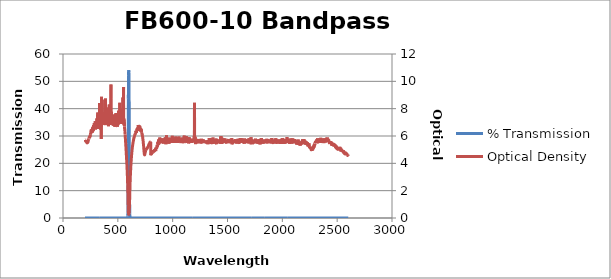
| Category | % Transmission |
|---|---|
| 2600.0 | 0.002 |
| 2599.0 | 0.002 |
| 2598.0 | 0.003 |
| 2597.0 | 0.002 |
| 2596.0 | 0.002 |
| 2595.0 | 0.003 |
| 2594.0 | 0.002 |
| 2593.0 | 0.002 |
| 2592.0 | 0.002 |
| 2591.0 | 0.002 |
| 2590.0 | 0.002 |
| 2589.0 | 0.002 |
| 2588.0 | 0.002 |
| 2587.0 | 0.002 |
| 2586.0 | 0.002 |
| 2585.0 | 0.002 |
| 2584.0 | 0.002 |
| 2583.0 | 0.002 |
| 2582.0 | 0.002 |
| 2581.0 | 0.002 |
| 2580.0 | 0.002 |
| 2579.0 | 0.002 |
| 2578.0 | 0.002 |
| 2577.0 | 0.002 |
| 2576.0 | 0.002 |
| 2575.0 | 0.002 |
| 2574.0 | 0.002 |
| 2573.0 | 0.002 |
| 2572.0 | 0.002 |
| 2571.0 | 0.002 |
| 2570.0 | 0.002 |
| 2569.0 | 0.002 |
| 2568.0 | 0.002 |
| 2567.0 | 0.002 |
| 2566.0 | 0.002 |
| 2565.0 | 0.002 |
| 2564.0 | 0.002 |
| 2563.0 | 0.002 |
| 2562.0 | 0.002 |
| 2561.0 | 0.001 |
| 2560.0 | 0.002 |
| 2559.0 | 0.002 |
| 2558.0 | 0.001 |
| 2557.0 | 0.002 |
| 2556.0 | 0.001 |
| 2555.0 | 0.001 |
| 2554.0 | 0.001 |
| 2553.0 | 0.001 |
| 2552.0 | 0.001 |
| 2551.0 | 0.001 |
| 2550.0 | 0.001 |
| 2549.0 | 0.001 |
| 2548.0 | 0.001 |
| 2547.0 | 0.001 |
| 2546.0 | 0.001 |
| 2545.0 | 0.001 |
| 2544.0 | 0.001 |
| 2543.0 | 0.001 |
| 2542.0 | 0.001 |
| 2541.0 | 0.001 |
| 2540.0 | 0.001 |
| 2539.0 | 0.001 |
| 2538.0 | 0.001 |
| 2537.0 | 0.001 |
| 2536.0 | 0.001 |
| 2535.0 | 0.001 |
| 2534.0 | 0.001 |
| 2533.0 | 0.001 |
| 2532.0 | 0.001 |
| 2531.0 | 0.001 |
| 2530.0 | 0.001 |
| 2529.0 | 0.001 |
| 2528.0 | 0.001 |
| 2527.0 | 0.001 |
| 2526.0 | 0.001 |
| 2525.0 | 0.001 |
| 2524.0 | 0.001 |
| 2523.0 | 0.001 |
| 2522.0 | 0.001 |
| 2521.0 | 0.001 |
| 2520.0 | 0.001 |
| 2519.0 | 0.001 |
| 2518.0 | 0.001 |
| 2517.0 | 0.001 |
| 2516.0 | 0.001 |
| 2515.0 | 0.001 |
| 2514.0 | 0.001 |
| 2513.0 | 0.001 |
| 2512.0 | 0.001 |
| 2511.0 | 0.001 |
| 2510.0 | 0.001 |
| 2509.0 | 0.001 |
| 2508.0 | 0.001 |
| 2507.0 | 0.001 |
| 2506.0 | 0.001 |
| 2505.0 | 0.001 |
| 2504.0 | 0.001 |
| 2503.0 | 0.001 |
| 2502.0 | 0.001 |
| 2501.0 | 0.001 |
| 2500.0 | 0.001 |
| 2499.0 | 0.001 |
| 2498.0 | 0.001 |
| 2497.0 | 0.001 |
| 2496.0 | 0.001 |
| 2495.0 | 0.001 |
| 2494.0 | 0.001 |
| 2493.0 | 0.001 |
| 2492.0 | 0.001 |
| 2491.0 | 0.001 |
| 2490.0 | 0.001 |
| 2489.0 | 0.001 |
| 2488.0 | 0.001 |
| 2487.0 | 0.001 |
| 2486.0 | 0.001 |
| 2485.0 | 0.001 |
| 2484.0 | 0.001 |
| 2483.0 | 0.001 |
| 2482.0 | 0.001 |
| 2481.0 | 0 |
| 2480.0 | 0 |
| 2479.0 | 0.001 |
| 2478.0 | 0.001 |
| 2477.0 | 0.001 |
| 2476.0 | 0.001 |
| 2475.0 | 0 |
| 2474.0 | 0.001 |
| 2473.0 | 0 |
| 2472.0 | 0.001 |
| 2471.0 | 0 |
| 2470.0 | 0.001 |
| 2469.0 | 0 |
| 2468.0 | 0 |
| 2467.0 | 0.001 |
| 2466.0 | 0 |
| 2465.0 | 0 |
| 2464.0 | 0 |
| 2463.0 | 0 |
| 2462.0 | 0.001 |
| 2461.0 | 0 |
| 2460.0 | 0 |
| 2459.0 | 0 |
| 2458.0 | 0.001 |
| 2457.0 | 0 |
| 2456.0 | 0 |
| 2455.0 | 0 |
| 2454.0 | 0.001 |
| 2453.0 | 0 |
| 2452.0 | 0 |
| 2451.0 | 0 |
| 2450.0 | 0 |
| 2449.0 | 0 |
| 2448.0 | 0 |
| 2447.0 | 0 |
| 2446.0 | 0 |
| 2445.0 | 0 |
| 2444.0 | 0 |
| 2443.0 | 0 |
| 2442.0 | 0 |
| 2441.0 | 0 |
| 2440.0 | 0 |
| 2439.0 | 0 |
| 2438.0 | 0 |
| 2437.0 | 0 |
| 2436.0 | 0 |
| 2435.0 | 0 |
| 2434.0 | 0 |
| 2433.0 | 0 |
| 2432.0 | 0 |
| 2431.0 | 0 |
| 2430.0 | 0 |
| 2429.0 | 0 |
| 2428.0 | 0 |
| 2427.0 | 0 |
| 2426.0 | 0 |
| 2425.0 | 0 |
| 2424.0 | 0 |
| 2423.0 | 0 |
| 2422.0 | 0 |
| 2421.0 | 0 |
| 2420.0 | 0 |
| 2419.0 | 0 |
| 2418.0 | 0 |
| 2417.0 | 0 |
| 2416.0 | 0 |
| 2415.0 | 0 |
| 2414.0 | 0 |
| 2413.0 | 0 |
| 2412.0 | 0 |
| 2411.0 | 0 |
| 2410.0 | 0 |
| 2409.0 | 0 |
| 2408.0 | 0 |
| 2407.0 | 0 |
| 2406.0 | 0 |
| 2405.0 | 0 |
| 2404.0 | 0 |
| 2403.0 | 0 |
| 2402.0 | 0 |
| 2401.0 | 0 |
| 2400.0 | 0 |
| 2399.0 | 0 |
| 2398.0 | 0 |
| 2397.0 | 0 |
| 2396.0 | 0 |
| 2395.0 | 0 |
| 2394.0 | 0 |
| 2393.0 | 0 |
| 2392.0 | 0 |
| 2391.0 | 0 |
| 2390.0 | 0 |
| 2389.0 | 0 |
| 2388.0 | 0 |
| 2387.0 | 0 |
| 2386.0 | 0 |
| 2385.0 | 0 |
| 2384.0 | 0 |
| 2383.0 | 0 |
| 2382.0 | 0 |
| 2381.0 | 0 |
| 2380.0 | 0 |
| 2379.0 | 0 |
| 2378.0 | 0 |
| 2377.0 | 0 |
| 2376.0 | 0 |
| 2375.0 | 0 |
| 2374.0 | 0 |
| 2373.0 | 0 |
| 2372.0 | 0 |
| 2371.0 | 0 |
| 2370.0 | 0 |
| 2369.0 | 0 |
| 2368.0 | 0 |
| 2367.0 | 0 |
| 2366.0 | 0 |
| 2365.0 | 0 |
| 2364.0 | 0 |
| 2363.0 | 0 |
| 2362.0 | 0 |
| 2361.0 | 0 |
| 2360.0 | 0 |
| 2359.0 | 0 |
| 2358.0 | 0 |
| 2357.0 | 0 |
| 2356.0 | 0 |
| 2355.0 | 0 |
| 2354.0 | 0 |
| 2353.0 | 0 |
| 2352.0 | 0 |
| 2351.0 | 0 |
| 2350.0 | 0 |
| 2349.0 | 0 |
| 2348.0 | 0 |
| 2347.0 | 0 |
| 2346.0 | 0 |
| 2345.0 | 0 |
| 2344.0 | 0 |
| 2343.0 | 0 |
| 2342.0 | 0 |
| 2341.0 | 0 |
| 2340.0 | 0 |
| 2339.0 | 0 |
| 2338.0 | 0 |
| 2337.0 | 0 |
| 2336.0 | 0 |
| 2335.0 | 0 |
| 2334.0 | 0 |
| 2333.0 | 0 |
| 2332.0 | 0 |
| 2331.0 | 0 |
| 2330.0 | 0 |
| 2329.0 | 0 |
| 2328.0 | 0 |
| 2327.0 | 0 |
| 2326.0 | 0 |
| 2325.0 | 0 |
| 2324.0 | 0 |
| 2323.0 | 0 |
| 2322.0 | 0 |
| 2321.0 | 0 |
| 2320.0 | 0 |
| 2319.0 | 0 |
| 2318.0 | 0 |
| 2317.0 | 0 |
| 2316.0 | 0 |
| 2315.0 | 0 |
| 2314.0 | 0 |
| 2313.0 | 0 |
| 2312.0 | 0 |
| 2311.0 | 0 |
| 2310.0 | 0 |
| 2309.0 | 0 |
| 2308.0 | 0 |
| 2307.0 | 0 |
| 2306.0 | 0 |
| 2305.0 | 0 |
| 2304.0 | 0 |
| 2303.0 | 0 |
| 2302.0 | 0 |
| 2301.0 | 0 |
| 2300.0 | 0 |
| 2299.0 | 0 |
| 2298.0 | 0 |
| 2297.0 | 0 |
| 2296.0 | 0 |
| 2295.0 | 0 |
| 2294.0 | 0 |
| 2293.0 | 0.001 |
| 2292.0 | 0 |
| 2291.0 | 0 |
| 2290.0 | 0.001 |
| 2289.0 | 0.001 |
| 2288.0 | 0.001 |
| 2287.0 | 0.001 |
| 2286.0 | 0 |
| 2285.0 | 0.001 |
| 2284.0 | 0.001 |
| 2283.0 | 0.001 |
| 2282.0 | 0.001 |
| 2281.0 | 0.001 |
| 2280.0 | 0.001 |
| 2279.0 | 0.001 |
| 2278.0 | 0.001 |
| 2277.0 | 0.001 |
| 2276.0 | 0.001 |
| 2275.0 | 0.001 |
| 2274.0 | 0.001 |
| 2273.0 | 0.001 |
| 2272.0 | 0.001 |
| 2271.0 | 0.001 |
| 2270.0 | 0.001 |
| 2269.0 | 0.001 |
| 2268.0 | 0.001 |
| 2267.0 | 0.001 |
| 2266.0 | 0.001 |
| 2265.0 | 0.001 |
| 2264.0 | 0.001 |
| 2263.0 | 0.001 |
| 2262.0 | 0.001 |
| 2261.0 | 0.001 |
| 2260.0 | 0.001 |
| 2259.0 | 0.001 |
| 2258.0 | 0.001 |
| 2257.0 | 0.001 |
| 2256.0 | 0.001 |
| 2255.0 | 0.001 |
| 2254.0 | 0.001 |
| 2253.0 | 0.001 |
| 2252.0 | 0.001 |
| 2251.0 | 0.001 |
| 2250.0 | 0.001 |
| 2249.0 | 0.001 |
| 2248.0 | 0.001 |
| 2247.0 | 0.001 |
| 2246.0 | 0.001 |
| 2245.0 | 0.001 |
| 2244.0 | 0 |
| 2243.0 | 0 |
| 2242.0 | 0 |
| 2241.0 | 0.001 |
| 2240.0 | 0 |
| 2239.0 | 0 |
| 2238.0 | 0.001 |
| 2237.0 | 0 |
| 2236.0 | 0.001 |
| 2235.0 | 0 |
| 2234.0 | 0.001 |
| 2233.0 | 0.001 |
| 2232.0 | 0 |
| 2231.0 | 0 |
| 2230.0 | 0 |
| 2229.0 | 0 |
| 2228.0 | 0 |
| 2227.0 | 0 |
| 2226.0 | 0 |
| 2225.0 | 0 |
| 2224.0 | 0 |
| 2223.0 | 0 |
| 2222.0 | 0 |
| 2221.0 | 0 |
| 2220.0 | 0 |
| 2219.0 | 0 |
| 2218.0 | 0 |
| 2217.0 | 0 |
| 2216.0 | 0 |
| 2215.0 | 0 |
| 2214.0 | 0 |
| 2213.0 | 0 |
| 2212.0 | 0 |
| 2211.0 | 0 |
| 2210.0 | 0 |
| 2209.0 | 0 |
| 2208.0 | 0 |
| 2207.0 | 0 |
| 2206.0 | 0 |
| 2205.0 | 0 |
| 2204.0 | 0 |
| 2203.0 | 0 |
| 2202.0 | 0 |
| 2201.0 | 0 |
| 2200.0 | 0 |
| 2199.0 | 0 |
| 2198.0 | 0 |
| 2197.0 | 0 |
| 2196.0 | 0 |
| 2195.0 | 0 |
| 2194.0 | 0 |
| 2193.0 | 0 |
| 2192.0 | 0 |
| 2191.0 | 0 |
| 2190.0 | 0 |
| 2189.0 | 0 |
| 2188.0 | 0 |
| 2187.0 | 0 |
| 2186.0 | 0 |
| 2185.0 | 0 |
| 2184.0 | 0 |
| 2183.0 | 0 |
| 2182.0 | 0 |
| 2181.0 | 0 |
| 2180.0 | 0 |
| 2179.0 | 0 |
| 2178.0 | 0 |
| 2177.0 | 0 |
| 2176.0 | 0 |
| 2175.0 | 0 |
| 2174.0 | 0 |
| 2173.0 | 0 |
| 2172.0 | 0 |
| 2171.0 | 0 |
| 2170.0 | 0 |
| 2169.0 | 0 |
| 2168.0 | 0 |
| 2167.0 | 0 |
| 2166.0 | 0 |
| 2165.0 | 0 |
| 2164.0 | 0 |
| 2163.0 | 0 |
| 2162.0 | 0 |
| 2161.0 | 0.001 |
| 2160.0 | 0 |
| 2159.0 | 0 |
| 2158.0 | 0 |
| 2157.0 | 0 |
| 2156.0 | 0 |
| 2155.0 | 0 |
| 2154.0 | 0 |
| 2153.0 | 0 |
| 2152.0 | 0 |
| 2151.0 | 0 |
| 2150.0 | 0 |
| 2149.0 | 0 |
| 2148.0 | 0 |
| 2147.0 | 0 |
| 2146.0 | 0 |
| 2145.0 | 0 |
| 2144.0 | 0 |
| 2143.0 | 0 |
| 2142.0 | 0 |
| 2141.0 | 0 |
| 2140.0 | 0 |
| 2139.0 | 0 |
| 2138.0 | 0 |
| 2137.0 | 0 |
| 2136.0 | 0 |
| 2135.0 | 0 |
| 2134.0 | 0 |
| 2133.0 | 0 |
| 2132.0 | 0 |
| 2131.0 | 0 |
| 2130.0 | 0 |
| 2129.0 | 0 |
| 2128.0 | 0 |
| 2127.0 | 0 |
| 2126.0 | 0 |
| 2125.0 | 0 |
| 2124.0 | 0 |
| 2123.0 | 0 |
| 2122.0 | 0 |
| 2121.0 | 0 |
| 2120.0 | 0 |
| 2119.0 | 0 |
| 2118.0 | 0 |
| 2117.0 | 0 |
| 2116.0 | 0 |
| 2115.0 | 0 |
| 2114.0 | 0 |
| 2113.0 | 0 |
| 2112.0 | 0 |
| 2111.0 | 0 |
| 2110.0 | 0 |
| 2109.0 | 0 |
| 2108.0 | 0 |
| 2107.0 | 0 |
| 2106.0 | 0 |
| 2105.0 | 0 |
| 2104.0 | 0 |
| 2103.0 | 0 |
| 2102.0 | 0 |
| 2101.0 | 0 |
| 2100.0 | 0 |
| 2099.0 | 0 |
| 2098.0 | 0 |
| 2097.0 | 0 |
| 2096.0 | 0 |
| 2095.0 | 0 |
| 2094.0 | 0 |
| 2093.0 | 0 |
| 2092.0 | 0 |
| 2091.0 | 0 |
| 2090.0 | 0 |
| 2089.0 | 0 |
| 2088.0 | 0 |
| 2087.0 | 0 |
| 2086.0 | 0 |
| 2085.0 | 0 |
| 2084.0 | 0 |
| 2083.0 | 0 |
| 2082.0 | 0 |
| 2081.0 | 0 |
| 2080.0 | 0 |
| 2079.0 | 0 |
| 2078.0 | 0 |
| 2077.0 | 0 |
| 2076.0 | 0 |
| 2075.0 | 0 |
| 2074.0 | 0 |
| 2073.0 | 0 |
| 2072.0 | 0 |
| 2071.0 | 0 |
| 2070.0 | 0 |
| 2069.0 | 0 |
| 2068.0 | 0 |
| 2067.0 | 0 |
| 2066.0 | 0 |
| 2065.0 | 0 |
| 2064.0 | 0 |
| 2063.0 | 0 |
| 2062.0 | 0 |
| 2061.0 | 0 |
| 2060.0 | 0 |
| 2059.0 | 0 |
| 2058.0 | 0 |
| 2057.0 | 0 |
| 2056.0 | 0 |
| 2055.0 | 0 |
| 2054.0 | 0 |
| 2053.0 | 0 |
| 2052.0 | 0 |
| 2051.0 | 0 |
| 2050.0 | 0 |
| 2049.0 | 0 |
| 2048.0 | 0 |
| 2047.0 | 0 |
| 2046.0 | 0 |
| 2045.0 | 0 |
| 2044.0 | 0 |
| 2043.0 | 0 |
| 2042.0 | 0 |
| 2041.0 | 0 |
| 2040.0 | 0 |
| 2039.0 | 0 |
| 2038.0 | 0 |
| 2037.0 | 0 |
| 2036.0 | 0 |
| 2035.0 | 0 |
| 2034.0 | 0 |
| 2033.0 | 0 |
| 2032.0 | 0 |
| 2031.0 | 0 |
| 2030.0 | 0 |
| 2029.0 | 0 |
| 2028.0 | 0 |
| 2027.0 | 0 |
| 2026.0 | 0 |
| 2025.0 | 0 |
| 2024.0 | 0 |
| 2023.0 | 0 |
| 2022.0 | 0 |
| 2021.0 | 0 |
| 2020.0 | 0 |
| 2019.0 | 0 |
| 2018.0 | 0 |
| 2017.0 | 0 |
| 2016.0 | 0 |
| 2015.0 | 0 |
| 2014.0 | 0 |
| 2013.0 | 0 |
| 2012.0 | 0 |
| 2011.0 | 0 |
| 2010.0 | 0 |
| 2009.0 | 0 |
| 2008.0 | 0 |
| 2007.0 | 0 |
| 2006.0 | 0 |
| 2005.0 | 0 |
| 2004.0 | 0 |
| 2003.0 | 0 |
| 2002.0 | 0 |
| 2001.0 | 0 |
| 2000.0 | 0 |
| 1999.0 | 0 |
| 1998.0 | 0 |
| 1997.0 | 0 |
| 1996.0 | 0 |
| 1995.0 | 0 |
| 1994.0 | 0 |
| 1993.0 | 0 |
| 1992.0 | 0 |
| 1991.0 | 0 |
| 1990.0 | 0 |
| 1989.0 | 0 |
| 1988.0 | 0 |
| 1987.0 | 0 |
| 1986.0 | 0 |
| 1985.0 | 0 |
| 1984.0 | 0 |
| 1983.0 | 0 |
| 1982.0 | 0 |
| 1981.0 | 0 |
| 1980.0 | 0 |
| 1979.0 | 0 |
| 1978.0 | 0 |
| 1977.0 | 0 |
| 1976.0 | 0 |
| 1975.0 | 0 |
| 1974.0 | 0 |
| 1973.0 | 0 |
| 1972.0 | 0 |
| 1971.0 | 0 |
| 1970.0 | 0 |
| 1969.0 | 0 |
| 1968.0 | 0 |
| 1967.0 | 0 |
| 1966.0 | 0 |
| 1965.0 | 0 |
| 1964.0 | 0 |
| 1963.0 | 0 |
| 1962.0 | 0 |
| 1961.0 | 0 |
| 1960.0 | 0 |
| 1959.0 | 0 |
| 1958.0 | 0 |
| 1957.0 | 0 |
| 1956.0 | 0 |
| 1955.0 | 0 |
| 1954.0 | 0 |
| 1953.0 | 0 |
| 1952.0 | 0 |
| 1951.0 | 0 |
| 1950.0 | 0 |
| 1949.0 | 0 |
| 1948.0 | 0 |
| 1947.0 | 0 |
| 1946.0 | 0 |
| 1945.0 | 0 |
| 1944.0 | 0 |
| 1943.0 | 0 |
| 1942.0 | 0 |
| 1941.0 | 0 |
| 1940.0 | 0 |
| 1939.0 | 0 |
| 1938.0 | 0 |
| 1937.0 | 0 |
| 1936.0 | 0 |
| 1935.0 | 0 |
| 1934.0 | 0 |
| 1933.0 | 0 |
| 1932.0 | 0 |
| 1931.0 | 0 |
| 1930.0 | 0 |
| 1929.0 | 0 |
| 1928.0 | 0 |
| 1927.0 | 0 |
| 1926.0 | 0 |
| 1925.0 | 0 |
| 1924.0 | 0 |
| 1923.0 | 0 |
| 1922.0 | 0 |
| 1921.0 | 0 |
| 1920.0 | 0 |
| 1919.0 | 0 |
| 1918.0 | 0 |
| 1917.0 | 0 |
| 1916.0 | 0 |
| 1915.0 | 0 |
| 1914.0 | 0 |
| 1913.0 | 0 |
| 1912.0 | 0 |
| 1911.0 | 0 |
| 1910.0 | 0 |
| 1909.0 | 0 |
| 1908.0 | 0 |
| 1907.0 | 0 |
| 1906.0 | 0 |
| 1905.0 | 0 |
| 1904.0 | 0 |
| 1903.0 | 0 |
| 1902.0 | 0 |
| 1901.0 | 0 |
| 1900.0 | 0 |
| 1899.0 | 0 |
| 1898.0 | 0 |
| 1897.0 | 0 |
| 1896.0 | 0 |
| 1895.0 | 0 |
| 1894.0 | 0 |
| 1893.0 | 0 |
| 1892.0 | 0 |
| 1891.0 | 0 |
| 1890.0 | 0 |
| 1889.0 | 0 |
| 1888.0 | 0 |
| 1887.0 | 0 |
| 1886.0 | 0 |
| 1885.0 | 0 |
| 1884.0 | 0 |
| 1883.0 | 0 |
| 1882.0 | 0 |
| 1881.0 | 0 |
| 1880.0 | 0 |
| 1879.0 | 0 |
| 1878.0 | 0 |
| 1877.0 | 0 |
| 1876.0 | 0 |
| 1875.0 | 0 |
| 1874.0 | 0 |
| 1873.0 | 0 |
| 1872.0 | 0 |
| 1871.0 | 0 |
| 1870.0 | 0 |
| 1869.0 | 0 |
| 1868.0 | 0 |
| 1867.0 | 0 |
| 1866.0 | 0 |
| 1865.0 | 0 |
| 1864.0 | 0 |
| 1863.0 | 0 |
| 1862.0 | 0 |
| 1861.0 | 0 |
| 1860.0 | 0 |
| 1859.0 | 0 |
| 1858.0 | 0 |
| 1857.0 | 0 |
| 1856.0 | 0 |
| 1855.0 | 0 |
| 1854.0 | 0 |
| 1853.0 | 0 |
| 1852.0 | 0 |
| 1851.0 | 0 |
| 1850.0 | 0 |
| 1849.0 | 0 |
| 1848.0 | 0 |
| 1847.0 | 0 |
| 1846.0 | 0 |
| 1845.0 | 0 |
| 1844.0 | 0 |
| 1843.0 | 0 |
| 1842.0 | 0 |
| 1841.0 | 0 |
| 1840.0 | 0 |
| 1839.0 | 0 |
| 1838.0 | 0 |
| 1837.0 | 0 |
| 1836.0 | 0 |
| 1835.0 | 0 |
| 1834.0 | 0 |
| 1833.0 | 0 |
| 1832.0 | 0 |
| 1831.0 | 0 |
| 1830.0 | 0 |
| 1829.0 | 0 |
| 1828.0 | 0 |
| 1827.0 | 0 |
| 1826.0 | 0 |
| 1825.0 | 0 |
| 1824.0 | 0 |
| 1823.0 | 0 |
| 1822.0 | 0 |
| 1821.0 | 0 |
| 1820.0 | 0 |
| 1819.0 | 0 |
| 1818.0 | 0 |
| 1817.0 | 0 |
| 1816.0 | 0 |
| 1815.0 | 0 |
| 1814.0 | 0 |
| 1813.0 | 0 |
| 1812.0 | 0 |
| 1811.0 | 0 |
| 1810.0 | 0 |
| 1809.0 | 0 |
| 1808.0 | 0 |
| 1807.0 | 0 |
| 1806.0 | 0 |
| 1805.0 | 0 |
| 1804.0 | 0 |
| 1803.0 | 0 |
| 1802.0 | 0 |
| 1801.0 | 0 |
| 1800.0 | 0 |
| 1799.0 | 0 |
| 1798.0 | 0 |
| 1797.0 | 0 |
| 1796.0 | 0 |
| 1795.0 | 0 |
| 1794.0 | 0 |
| 1793.0 | 0 |
| 1792.0 | 0 |
| 1791.0 | 0 |
| 1790.0 | 0 |
| 1789.0 | 0 |
| 1788.0 | 0 |
| 1787.0 | 0 |
| 1786.0 | 0 |
| 1785.0 | 0 |
| 1784.0 | 0 |
| 1783.0 | 0 |
| 1782.0 | 0 |
| 1781.0 | 0 |
| 1780.0 | 0 |
| 1779.0 | 0 |
| 1778.0 | 0 |
| 1777.0 | 0 |
| 1776.0 | 0 |
| 1775.0 | 0 |
| 1774.0 | 0 |
| 1773.0 | 0 |
| 1772.0 | 0 |
| 1771.0 | 0 |
| 1770.0 | 0 |
| 1769.0 | 0 |
| 1768.0 | 0 |
| 1767.0 | 0 |
| 1766.0 | 0 |
| 1765.0 | 0 |
| 1764.0 | 0 |
| 1763.0 | 0 |
| 1762.0 | 0 |
| 1761.0 | 0 |
| 1760.0 | 0 |
| 1759.0 | 0 |
| 1758.0 | 0 |
| 1757.0 | 0 |
| 1756.0 | 0 |
| 1755.0 | 0 |
| 1754.0 | 0 |
| 1753.0 | 0 |
| 1752.0 | 0 |
| 1751.0 | 0 |
| 1750.0 | 0 |
| 1749.0 | 0 |
| 1748.0 | 0 |
| 1747.0 | 0 |
| 1746.0 | 0 |
| 1745.0 | 0 |
| 1744.0 | 0 |
| 1743.0 | 0 |
| 1742.0 | 0 |
| 1741.0 | 0 |
| 1740.0 | 0 |
| 1739.0 | 0 |
| 1738.0 | 0 |
| 1737.0 | 0 |
| 1736.0 | 0 |
| 1735.0 | 0 |
| 1734.0 | 0 |
| 1733.0 | 0 |
| 1732.0 | 0 |
| 1731.0 | 0 |
| 1730.0 | 0 |
| 1729.0 | 0 |
| 1728.0 | 0 |
| 1727.0 | 0 |
| 1726.0 | 0 |
| 1725.0 | 0 |
| 1724.0 | 0 |
| 1723.0 | 0 |
| 1722.0 | 0 |
| 1721.0 | 0 |
| 1720.0 | 0 |
| 1719.0 | 0 |
| 1718.0 | 0 |
| 1717.0 | 0 |
| 1716.0 | 0 |
| 1715.0 | 0 |
| 1714.0 | 0 |
| 1713.0 | 0 |
| 1712.0 | 0 |
| 1711.0 | 0 |
| 1710.0 | 0 |
| 1709.0 | 0 |
| 1708.0 | 0 |
| 1707.0 | 0 |
| 1706.0 | 0 |
| 1705.0 | 0 |
| 1704.0 | 0 |
| 1703.0 | 0 |
| 1702.0 | 0 |
| 1701.0 | 0 |
| 1700.0 | 0 |
| 1699.0 | 0 |
| 1698.0 | 0 |
| 1697.0 | 0 |
| 1696.0 | 0 |
| 1695.0 | 0 |
| 1694.0 | 0 |
| 1693.0 | 0 |
| 1692.0 | 0 |
| 1691.0 | 0 |
| 1690.0 | 0 |
| 1689.0 | 0 |
| 1688.0 | 0 |
| 1687.0 | 0 |
| 1686.0 | 0 |
| 1685.0 | 0 |
| 1684.0 | 0 |
| 1683.0 | 0 |
| 1682.0 | 0 |
| 1681.0 | 0 |
| 1680.0 | 0 |
| 1679.0 | 0 |
| 1678.0 | 0 |
| 1677.0 | 0 |
| 1676.0 | 0 |
| 1675.0 | 0 |
| 1674.0 | 0 |
| 1673.0 | 0 |
| 1672.0 | 0 |
| 1671.0 | 0 |
| 1670.0 | 0 |
| 1669.0 | 0 |
| 1668.0 | 0 |
| 1667.0 | 0 |
| 1666.0 | 0 |
| 1665.0 | 0 |
| 1664.0 | 0 |
| 1663.0 | 0 |
| 1662.0 | 0 |
| 1661.0 | 0 |
| 1660.0 | 0 |
| 1659.0 | 0 |
| 1658.0 | 0 |
| 1657.0 | 0 |
| 1656.0 | 0 |
| 1655.0 | 0 |
| 1654.0 | 0 |
| 1653.0 | 0 |
| 1652.0 | 0 |
| 1651.0 | 0 |
| 1650.0 | 0 |
| 1649.0 | 0 |
| 1648.0 | 0 |
| 1647.0 | 0 |
| 1646.0 | 0 |
| 1645.0 | 0 |
| 1644.0 | 0 |
| 1643.0 | 0 |
| 1642.0 | 0 |
| 1641.0 | 0 |
| 1640.0 | 0 |
| 1639.0 | 0 |
| 1638.0 | 0 |
| 1637.0 | 0 |
| 1636.0 | 0 |
| 1635.0 | 0 |
| 1634.0 | 0 |
| 1633.0 | 0 |
| 1632.0 | 0 |
| 1631.0 | 0 |
| 1630.0 | 0 |
| 1629.0 | 0 |
| 1628.0 | 0 |
| 1627.0 | 0 |
| 1626.0 | 0 |
| 1625.0 | 0 |
| 1624.0 | 0 |
| 1623.0 | 0 |
| 1622.0 | 0 |
| 1621.0 | 0 |
| 1620.0 | 0 |
| 1619.0 | 0 |
| 1618.0 | 0 |
| 1617.0 | 0 |
| 1616.0 | 0 |
| 1615.0 | 0 |
| 1614.0 | 0 |
| 1613.0 | 0 |
| 1612.0 | 0 |
| 1611.0 | 0 |
| 1610.0 | 0 |
| 1609.0 | 0 |
| 1608.0 | 0 |
| 1607.0 | 0 |
| 1606.0 | 0 |
| 1605.0 | 0 |
| 1604.0 | 0 |
| 1603.0 | 0 |
| 1602.0 | 0 |
| 1601.0 | 0 |
| 1600.0 | 0 |
| 1599.0 | 0 |
| 1598.0 | 0 |
| 1597.0 | 0 |
| 1596.0 | 0 |
| 1595.0 | 0 |
| 1594.0 | 0 |
| 1593.0 | 0 |
| 1592.0 | 0 |
| 1591.0 | 0 |
| 1590.0 | 0 |
| 1589.0 | 0 |
| 1588.0 | 0 |
| 1587.0 | 0 |
| 1586.0 | 0 |
| 1585.0 | 0 |
| 1584.0 | 0 |
| 1583.0 | 0 |
| 1582.0 | 0 |
| 1581.0 | 0 |
| 1580.0 | 0 |
| 1579.0 | 0 |
| 1578.0 | 0 |
| 1577.0 | 0 |
| 1576.0 | 0 |
| 1575.0 | 0 |
| 1574.0 | 0 |
| 1573.0 | 0 |
| 1572.0 | 0 |
| 1571.0 | 0 |
| 1570.0 | 0 |
| 1569.0 | 0 |
| 1568.0 | 0 |
| 1567.0 | 0 |
| 1566.0 | 0 |
| 1565.0 | 0 |
| 1564.0 | 0 |
| 1563.0 | 0 |
| 1562.0 | 0 |
| 1561.0 | 0 |
| 1560.0 | 0 |
| 1559.0 | 0 |
| 1558.0 | 0 |
| 1557.0 | 0 |
| 1556.0 | 0 |
| 1555.0 | 0 |
| 1554.0 | 0 |
| 1553.0 | 0 |
| 1552.0 | 0 |
| 1551.0 | 0 |
| 1550.0 | 0 |
| 1549.0 | 0 |
| 1548.0 | 0 |
| 1547.0 | 0 |
| 1546.0 | 0 |
| 1545.0 | 0 |
| 1544.0 | 0 |
| 1543.0 | 0 |
| 1542.0 | 0 |
| 1541.0 | 0 |
| 1540.0 | 0 |
| 1539.0 | 0 |
| 1538.0 | 0 |
| 1537.0 | 0 |
| 1536.0 | 0 |
| 1535.0 | 0 |
| 1534.0 | 0 |
| 1533.0 | 0 |
| 1532.0 | 0 |
| 1531.0 | 0 |
| 1530.0 | 0 |
| 1529.0 | 0 |
| 1528.0 | 0 |
| 1527.0 | 0 |
| 1526.0 | 0 |
| 1525.0 | 0 |
| 1524.0 | 0 |
| 1523.0 | 0 |
| 1522.0 | 0 |
| 1521.0 | 0 |
| 1520.0 | 0 |
| 1519.0 | 0 |
| 1518.0 | 0 |
| 1517.0 | 0 |
| 1516.0 | 0 |
| 1515.0 | 0 |
| 1514.0 | 0 |
| 1513.0 | 0 |
| 1512.0 | 0 |
| 1511.0 | 0 |
| 1510.0 | 0 |
| 1509.0 | 0 |
| 1508.0 | 0 |
| 1507.0 | 0 |
| 1506.0 | 0 |
| 1505.0 | 0 |
| 1504.0 | 0 |
| 1503.0 | 0 |
| 1502.0 | 0 |
| 1501.0 | 0 |
| 1500.0 | 0 |
| 1499.0 | 0 |
| 1498.0 | 0 |
| 1497.0 | 0 |
| 1496.0 | 0 |
| 1495.0 | 0 |
| 1494.0 | 0 |
| 1493.0 | 0 |
| 1492.0 | 0 |
| 1491.0 | 0 |
| 1490.0 | 0 |
| 1489.0 | 0 |
| 1488.0 | 0 |
| 1487.0 | 0 |
| 1486.0 | 0 |
| 1485.0 | 0 |
| 1484.0 | 0 |
| 1483.0 | 0 |
| 1482.0 | 0 |
| 1481.0 | 0 |
| 1480.0 | 0 |
| 1479.0 | 0 |
| 1478.0 | 0 |
| 1477.0 | 0 |
| 1476.0 | 0 |
| 1475.0 | 0 |
| 1474.0 | 0 |
| 1473.0 | 0 |
| 1472.0 | 0 |
| 1471.0 | 0 |
| 1470.0 | 0 |
| 1469.0 | 0 |
| 1468.0 | 0 |
| 1467.0 | 0 |
| 1466.0 | 0 |
| 1465.0 | 0 |
| 1464.0 | 0 |
| 1463.0 | 0 |
| 1462.0 | 0 |
| 1461.0 | 0 |
| 1460.0 | 0 |
| 1459.0 | 0 |
| 1458.0 | 0 |
| 1457.0 | 0 |
| 1456.0 | 0 |
| 1455.0 | 0 |
| 1454.0 | 0 |
| 1453.0 | 0 |
| 1452.0 | 0 |
| 1451.0 | 0 |
| 1450.0 | 0 |
| 1449.0 | 0 |
| 1448.0 | 0 |
| 1447.0 | 0 |
| 1446.0 | 0 |
| 1445.0 | 0 |
| 1444.0 | 0 |
| 1443.0 | 0 |
| 1442.0 | 0 |
| 1441.0 | 0 |
| 1440.0 | 0 |
| 1439.0 | 0 |
| 1438.0 | 0 |
| 1437.0 | 0 |
| 1436.0 | 0 |
| 1435.0 | 0 |
| 1434.0 | 0 |
| 1433.0 | 0 |
| 1432.0 | 0 |
| 1431.0 | 0 |
| 1430.0 | 0 |
| 1429.0 | 0 |
| 1428.0 | 0 |
| 1427.0 | 0 |
| 1426.0 | 0 |
| 1425.0 | 0 |
| 1424.0 | 0 |
| 1423.0 | 0 |
| 1422.0 | 0 |
| 1421.0 | 0 |
| 1420.0 | 0 |
| 1419.0 | 0 |
| 1418.0 | 0 |
| 1417.0 | 0 |
| 1416.0 | 0 |
| 1415.0 | 0 |
| 1414.0 | 0 |
| 1413.0 | 0 |
| 1412.0 | 0 |
| 1411.0 | 0 |
| 1410.0 | 0 |
| 1409.0 | 0 |
| 1408.0 | 0 |
| 1407.0 | 0 |
| 1406.0 | 0 |
| 1405.0 | 0 |
| 1404.0 | 0 |
| 1403.0 | 0 |
| 1402.0 | 0 |
| 1401.0 | 0 |
| 1400.0 | 0 |
| 1399.0 | 0 |
| 1398.0 | 0 |
| 1397.0 | 0 |
| 1396.0 | 0 |
| 1395.0 | 0 |
| 1394.0 | 0 |
| 1393.0 | 0 |
| 1392.0 | 0 |
| 1391.0 | 0 |
| 1390.0 | 0 |
| 1389.0 | 0 |
| 1388.0 | 0 |
| 1387.0 | 0 |
| 1386.0 | 0 |
| 1385.0 | 0 |
| 1384.0 | 0 |
| 1383.0 | 0 |
| 1382.0 | 0 |
| 1381.0 | 0 |
| 1380.0 | 0 |
| 1379.0 | 0 |
| 1378.0 | 0 |
| 1377.0 | 0 |
| 1376.0 | 0 |
| 1375.0 | 0 |
| 1374.0 | 0 |
| 1373.0 | 0 |
| 1372.0 | 0 |
| 1371.0 | 0 |
| 1370.0 | 0 |
| 1369.0 | 0 |
| 1368.0 | 0 |
| 1367.0 | 0 |
| 1366.0 | 0 |
| 1365.0 | 0 |
| 1364.0 | 0 |
| 1363.0 | 0 |
| 1362.0 | 0 |
| 1361.0 | 0 |
| 1360.0 | 0 |
| 1359.0 | 0 |
| 1358.0 | 0 |
| 1357.0 | 0 |
| 1356.0 | 0 |
| 1355.0 | 0 |
| 1354.0 | 0 |
| 1353.0 | 0 |
| 1352.0 | 0 |
| 1351.0 | 0 |
| 1350.0 | 0 |
| 1349.0 | 0 |
| 1348.0 | 0 |
| 1347.0 | 0 |
| 1346.0 | 0 |
| 1345.0 | 0 |
| 1344.0 | 0 |
| 1343.0 | 0 |
| 1342.0 | 0 |
| 1341.0 | 0 |
| 1340.0 | 0 |
| 1339.0 | 0 |
| 1338.0 | 0 |
| 1337.0 | 0 |
| 1336.0 | 0 |
| 1335.0 | 0 |
| 1334.0 | 0 |
| 1333.0 | 0 |
| 1332.0 | 0 |
| 1331.0 | 0 |
| 1330.0 | 0 |
| 1329.0 | 0 |
| 1328.0 | 0 |
| 1327.0 | 0 |
| 1326.0 | 0 |
| 1325.0 | 0 |
| 1324.0 | 0 |
| 1323.0 | 0 |
| 1322.0 | 0 |
| 1321.0 | 0 |
| 1320.0 | 0 |
| 1319.0 | 0 |
| 1318.0 | 0 |
| 1317.0 | 0 |
| 1316.0 | 0 |
| 1315.0 | 0 |
| 1314.0 | 0 |
| 1313.0 | 0 |
| 1312.0 | 0 |
| 1311.0 | 0 |
| 1310.0 | 0 |
| 1309.0 | 0 |
| 1308.0 | 0 |
| 1307.0 | 0 |
| 1306.0 | 0 |
| 1305.0 | 0 |
| 1304.0 | 0 |
| 1303.0 | 0 |
| 1302.0 | 0 |
| 1301.0 | 0 |
| 1300.0 | 0 |
| 1299.0 | 0 |
| 1298.0 | 0 |
| 1297.0 | 0 |
| 1296.0 | 0 |
| 1295.0 | 0 |
| 1294.0 | 0 |
| 1293.0 | 0 |
| 1292.0 | 0 |
| 1291.0 | 0 |
| 1290.0 | 0 |
| 1289.0 | 0 |
| 1288.0 | 0 |
| 1287.0 | 0 |
| 1286.0 | 0 |
| 1285.0 | 0 |
| 1284.0 | 0 |
| 1283.0 | 0 |
| 1282.0 | 0 |
| 1281.0 | 0 |
| 1280.0 | 0 |
| 1279.0 | 0 |
| 1278.0 | 0 |
| 1277.0 | 0 |
| 1276.0 | 0 |
| 1275.0 | 0 |
| 1274.0 | 0 |
| 1273.0 | 0 |
| 1272.0 | 0 |
| 1271.0 | 0 |
| 1270.0 | 0 |
| 1269.0 | 0 |
| 1268.0 | 0 |
| 1267.0 | 0 |
| 1266.0 | 0 |
| 1265.0 | 0 |
| 1264.0 | 0 |
| 1263.0 | 0 |
| 1262.0 | 0 |
| 1261.0 | 0 |
| 1260.0 | 0 |
| 1259.0 | 0 |
| 1258.0 | 0 |
| 1257.0 | 0 |
| 1256.0 | 0 |
| 1255.0 | 0 |
| 1254.0 | 0 |
| 1253.0 | 0 |
| 1252.0 | 0 |
| 1251.0 | 0 |
| 1250.0 | 0 |
| 1249.0 | 0 |
| 1248.0 | 0 |
| 1247.0 | 0 |
| 1246.0 | 0 |
| 1245.0 | 0 |
| 1244.0 | 0 |
| 1243.0 | 0 |
| 1242.0 | 0 |
| 1241.0 | 0 |
| 1240.0 | 0 |
| 1239.0 | 0 |
| 1238.0 | 0 |
| 1237.0 | 0 |
| 1236.0 | 0 |
| 1235.0 | 0 |
| 1234.0 | 0 |
| 1233.0 | 0 |
| 1232.0 | 0 |
| 1231.0 | 0 |
| 1230.0 | 0 |
| 1229.0 | 0 |
| 1228.0 | 0 |
| 1227.0 | 0 |
| 1226.0 | 0 |
| 1225.0 | 0 |
| 1224.0 | 0 |
| 1223.0 | 0 |
| 1222.0 | 0 |
| 1221.0 | 0 |
| 1220.0 | 0 |
| 1219.0 | 0 |
| 1218.0 | 0 |
| 1217.0 | 0 |
| 1216.0 | 0 |
| 1215.0 | 0 |
| 1214.0 | 0 |
| 1213.0 | 0 |
| 1212.0 | 0 |
| 1211.0 | 0 |
| 1210.0 | 0 |
| 1209.0 | 0 |
| 1208.0 | 0 |
| 1207.0 | 0 |
| 1206.0 | 0 |
| 1205.0 | 0 |
| 1204.0 | 0 |
| 1203.0 | 0 |
| 1202.0 | 0 |
| 1201.0 | 0 |
| 1200.0 | 0 |
| 1199.0 | 0 |
| 1198.0 | 0 |
| 1197.0 | 0 |
| 1196.0 | 0 |
| 1195.0 | 0 |
| 1194.0 | 0 |
| 1193.0 | 0 |
| 1192.0 | 0 |
| 1191.0 | 0 |
| 1190.0 | 0 |
| 1189.0 | 0 |
| 1188.0 | 0 |
| 1187.0 | 0 |
| 1186.0 | 0 |
| 1185.0 | 0 |
| 1184.0 | 0 |
| 1183.0 | 0 |
| 1182.0 | 0 |
| 1181.0 | 0 |
| 1180.0 | 0 |
| 1179.0 | 0 |
| 1178.0 | 0 |
| 1177.0 | 0 |
| 1176.0 | 0 |
| 1175.0 | 0 |
| 1174.0 | 0 |
| 1173.0 | 0 |
| 1172.0 | 0 |
| 1171.0 | 0 |
| 1170.0 | 0 |
| 1169.0 | 0 |
| 1168.0 | 0 |
| 1167.0 | 0 |
| 1166.0 | 0 |
| 1165.0 | 0 |
| 1164.0 | 0 |
| 1163.0 | 0 |
| 1162.0 | 0 |
| 1161.0 | 0 |
| 1160.0 | 0 |
| 1159.0 | 0 |
| 1158.0 | 0 |
| 1157.0 | 0 |
| 1156.0 | 0 |
| 1155.0 | 0 |
| 1154.0 | 0 |
| 1153.0 | 0 |
| 1152.0 | 0 |
| 1151.0 | 0 |
| 1150.0 | 0 |
| 1149.0 | 0 |
| 1148.0 | 0 |
| 1147.0 | 0 |
| 1146.0 | 0 |
| 1145.0 | 0 |
| 1144.0 | 0 |
| 1143.0 | 0 |
| 1142.0 | 0 |
| 1141.0 | 0 |
| 1140.0 | 0 |
| 1139.0 | 0 |
| 1138.0 | 0 |
| 1137.0 | 0 |
| 1136.0 | 0 |
| 1135.0 | 0 |
| 1134.0 | 0 |
| 1133.0 | 0 |
| 1132.0 | 0 |
| 1131.0 | 0 |
| 1130.0 | 0 |
| 1129.0 | 0 |
| 1128.0 | 0 |
| 1127.0 | 0 |
| 1126.0 | 0 |
| 1125.0 | 0 |
| 1124.0 | 0 |
| 1123.0 | 0 |
| 1122.0 | 0 |
| 1121.0 | 0 |
| 1120.0 | 0 |
| 1119.0 | 0 |
| 1118.0 | 0 |
| 1117.0 | 0 |
| 1116.0 | 0 |
| 1115.0 | 0 |
| 1114.0 | 0 |
| 1113.0 | 0 |
| 1112.0 | 0 |
| 1111.0 | 0 |
| 1110.0 | 0 |
| 1109.0 | 0 |
| 1108.0 | 0 |
| 1107.0 | 0 |
| 1106.0 | 0 |
| 1105.0 | 0 |
| 1104.0 | 0 |
| 1103.0 | 0 |
| 1102.0 | 0 |
| 1101.0 | 0 |
| 1100.0 | 0 |
| 1099.0 | 0 |
| 1098.0 | 0 |
| 1097.0 | 0 |
| 1096.0 | 0 |
| 1095.0 | 0 |
| 1094.0 | 0 |
| 1093.0 | 0 |
| 1092.0 | 0 |
| 1091.0 | 0 |
| 1090.0 | 0 |
| 1089.0 | 0 |
| 1088.0 | 0 |
| 1087.0 | 0 |
| 1086.0 | 0 |
| 1085.0 | 0 |
| 1084.0 | 0 |
| 1083.0 | 0 |
| 1082.0 | 0 |
| 1081.0 | 0 |
| 1080.0 | 0 |
| 1079.0 | 0 |
| 1078.0 | 0 |
| 1077.0 | 0 |
| 1076.0 | 0 |
| 1075.0 | 0 |
| 1074.0 | 0 |
| 1073.0 | 0 |
| 1072.0 | 0 |
| 1071.0 | 0 |
| 1070.0 | 0 |
| 1069.0 | 0 |
| 1068.0 | 0 |
| 1067.0 | 0 |
| 1066.0 | 0 |
| 1065.0 | 0 |
| 1064.0 | 0 |
| 1063.0 | 0 |
| 1062.0 | 0 |
| 1061.0 | 0 |
| 1060.0 | 0 |
| 1059.0 | 0 |
| 1058.0 | 0 |
| 1057.0 | 0 |
| 1056.0 | 0 |
| 1055.0 | 0 |
| 1054.0 | 0 |
| 1053.0 | 0 |
| 1052.0 | 0 |
| 1051.0 | 0 |
| 1050.0 | 0 |
| 1049.0 | 0 |
| 1048.0 | 0 |
| 1047.0 | 0 |
| 1046.0 | 0 |
| 1045.0 | 0 |
| 1044.0 | 0 |
| 1043.0 | 0 |
| 1042.0 | 0 |
| 1041.0 | 0 |
| 1040.0 | 0 |
| 1039.0 | 0 |
| 1038.0 | 0 |
| 1037.0 | 0 |
| 1036.0 | 0 |
| 1035.0 | 0 |
| 1034.0 | 0 |
| 1033.0 | 0 |
| 1032.0 | 0 |
| 1031.0 | 0 |
| 1030.0 | 0 |
| 1029.0 | 0 |
| 1028.0 | 0 |
| 1027.0 | 0 |
| 1026.0 | 0 |
| 1025.0 | 0 |
| 1024.0 | 0 |
| 1023.0 | 0 |
| 1022.0 | 0 |
| 1021.0 | 0 |
| 1020.0 | 0 |
| 1019.0 | 0 |
| 1018.0 | 0 |
| 1017.0 | 0 |
| 1016.0 | 0 |
| 1015.0 | 0 |
| 1014.0 | 0 |
| 1013.0 | 0 |
| 1012.0 | 0 |
| 1011.0 | 0 |
| 1010.0 | 0 |
| 1009.0 | 0 |
| 1008.0 | 0 |
| 1007.0 | 0 |
| 1006.0 | 0 |
| 1005.0 | 0 |
| 1004.0 | 0 |
| 1003.0 | 0 |
| 1002.0 | 0 |
| 1001.0 | 0 |
| 1000.0 | 0 |
| 999.0 | 0 |
| 998.0 | 0 |
| 997.0 | 0 |
| 996.0 | 0 |
| 995.0 | 0 |
| 994.0 | 0 |
| 993.0 | 0 |
| 992.0 | 0 |
| 991.0 | 0 |
| 990.0 | 0 |
| 989.0 | 0 |
| 988.0 | 0 |
| 987.0 | 0 |
| 986.0 | 0 |
| 985.0 | 0 |
| 984.0 | 0 |
| 983.0 | 0 |
| 982.0 | 0 |
| 981.0 | 0 |
| 980.0 | 0 |
| 979.0 | 0 |
| 978.0 | 0 |
| 977.0 | 0 |
| 976.0 | 0 |
| 975.0 | 0 |
| 974.0 | 0 |
| 973.0 | 0 |
| 972.0 | 0 |
| 971.0 | 0 |
| 970.0 | 0 |
| 969.0 | 0 |
| 968.0 | 0 |
| 967.0 | 0 |
| 966.0 | 0 |
| 965.0 | 0 |
| 964.0 | 0 |
| 963.0 | 0 |
| 962.0 | 0 |
| 961.0 | 0 |
| 960.0 | 0 |
| 959.0 | 0 |
| 958.0 | 0 |
| 957.0 | 0 |
| 956.0 | 0 |
| 955.0 | 0 |
| 954.0 | 0 |
| 953.0 | 0 |
| 952.0 | 0 |
| 951.0 | 0 |
| 950.0 | 0 |
| 949.0 | 0 |
| 948.0 | 0 |
| 947.0 | 0 |
| 946.0 | 0 |
| 945.0 | 0 |
| 944.0 | 0 |
| 943.0 | 0 |
| 942.0 | 0 |
| 941.0 | 0 |
| 940.0 | 0 |
| 939.0 | 0 |
| 938.0 | 0 |
| 937.0 | 0 |
| 936.0 | 0 |
| 935.0 | 0 |
| 934.0 | 0 |
| 933.0 | 0 |
| 932.0 | 0 |
| 931.0 | 0 |
| 930.0 | 0 |
| 929.0 | 0 |
| 928.0 | 0 |
| 927.0 | 0 |
| 926.0 | 0 |
| 925.0 | 0 |
| 924.0 | 0 |
| 923.0 | 0 |
| 922.0 | 0 |
| 921.0 | 0 |
| 920.0 | 0 |
| 919.0 | 0 |
| 918.0 | 0 |
| 917.0 | 0 |
| 916.0 | 0 |
| 915.0 | 0 |
| 914.0 | 0 |
| 913.0 | 0 |
| 912.0 | 0 |
| 911.0 | 0 |
| 910.0 | 0 |
| 909.0 | 0 |
| 908.0 | 0 |
| 907.0 | 0 |
| 906.0 | 0 |
| 905.0 | 0 |
| 904.0 | 0 |
| 903.0 | 0 |
| 902.0 | 0 |
| 901.0 | 0 |
| 900.0 | 0 |
| 899.0 | 0 |
| 898.0 | 0 |
| 897.0 | 0 |
| 896.0 | 0 |
| 895.0 | 0 |
| 894.0 | 0 |
| 893.0 | 0 |
| 892.0 | 0 |
| 891.0 | 0 |
| 890.0 | 0 |
| 889.0 | 0 |
| 888.0 | 0 |
| 887.0 | 0 |
| 886.0 | 0 |
| 885.0 | 0 |
| 884.0 | 0 |
| 883.0 | 0 |
| 882.0 | 0 |
| 881.0 | 0 |
| 880.0 | 0 |
| 879.0 | 0 |
| 878.0 | 0 |
| 877.0 | 0 |
| 876.0 | 0 |
| 875.0 | 0 |
| 874.0 | 0 |
| 873.0 | 0 |
| 872.0 | 0 |
| 871.0 | 0 |
| 870.0 | 0 |
| 869.0 | 0 |
| 868.0 | 0 |
| 867.0 | 0 |
| 866.0 | 0 |
| 865.0 | 0 |
| 864.0 | 0 |
| 863.0 | 0 |
| 862.0 | 0.001 |
| 861.0 | 0.001 |
| 860.0 | 0.001 |
| 859.0 | 0 |
| 858.0 | 0 |
| 857.0 | 0.001 |
| 856.0 | 0.001 |
| 855.0 | 0.001 |
| 854.0 | 0.001 |
| 853.0 | 0.001 |
| 852.0 | 0.001 |
| 851.0 | 0.001 |
| 850.0 | 0.001 |
| 849.0 | 0.001 |
| 848.0 | 0.001 |
| 847.0 | 0.001 |
| 846.0 | 0.001 |
| 845.0 | 0.001 |
| 844.0 | 0.001 |
| 843.0 | 0.001 |
| 842.0 | 0.001 |
| 841.0 | 0.001 |
| 840.0 | 0.001 |
| 839.0 | 0.001 |
| 838.0 | 0.001 |
| 837.0 | 0.001 |
| 836.0 | 0.001 |
| 835.0 | 0.001 |
| 834.0 | 0.001 |
| 833.0 | 0.001 |
| 832.0 | 0.001 |
| 831.0 | 0.001 |
| 830.0 | 0.002 |
| 829.0 | 0.001 |
| 828.0 | 0.001 |
| 827.0 | 0.001 |
| 826.0 | 0.001 |
| 825.0 | 0.001 |
| 824.0 | 0.001 |
| 823.0 | 0.002 |
| 822.0 | 0.002 |
| 821.0 | 0.001 |
| 820.0 | 0.001 |
| 819.0 | 0.001 |
| 818.0 | 0.001 |
| 817.0 | 0.001 |
| 816.0 | 0.001 |
| 815.0 | 0.002 |
| 814.0 | 0.002 |
| 813.0 | 0.002 |
| 812.0 | 0.001 |
| 811.0 | 0.001 |
| 810.0 | 0.002 |
| 809.0 | 0.002 |
| 808.0 | 0.002 |
| 807.0 | 0.002 |
| 806.0 | 0.002 |
| 805.0 | 0.002 |
| 804.0 | 0.002 |
| 803.0 | 0.002 |
| 802.0 | 0.002 |
| 801.0 | 0.002 |
| 800.0 | 0.002 |
| 799.0 | 0 |
| 798.0 | 0 |
| 797.0 | 0 |
| 796.0 | 0 |
| 795.0 | 0 |
| 794.0 | 0 |
| 793.0 | 0 |
| 792.0 | 0 |
| 791.0 | 0 |
| 790.0 | 0 |
| 789.0 | 0 |
| 788.0 | 0 |
| 787.0 | 0 |
| 786.0 | 0 |
| 785.0 | 0 |
| 784.0 | 0 |
| 783.0 | 0 |
| 782.0 | 0 |
| 781.0 | 0 |
| 780.0 | 0.001 |
| 779.0 | 0.001 |
| 778.0 | 0.001 |
| 777.0 | 0.001 |
| 776.0 | 0.001 |
| 775.0 | 0.001 |
| 774.0 | 0.001 |
| 773.0 | 0.001 |
| 772.0 | 0.001 |
| 771.0 | 0.001 |
| 770.0 | 0.001 |
| 769.0 | 0.001 |
| 768.0 | 0.001 |
| 767.0 | 0.001 |
| 766.0 | 0.001 |
| 765.0 | 0.001 |
| 764.0 | 0.001 |
| 763.0 | 0.001 |
| 762.0 | 0.001 |
| 761.0 | 0.001 |
| 760.0 | 0.001 |
| 759.0 | 0.001 |
| 758.0 | 0.001 |
| 757.0 | 0.001 |
| 756.0 | 0.001 |
| 755.0 | 0.001 |
| 754.0 | 0.001 |
| 753.0 | 0.001 |
| 752.0 | 0.001 |
| 751.0 | 0.001 |
| 750.0 | 0.002 |
| 749.0 | 0.002 |
| 748.0 | 0.002 |
| 747.0 | 0.002 |
| 746.0 | 0.002 |
| 745.0 | 0.002 |
| 744.0 | 0.002 |
| 743.0 | 0.002 |
| 742.0 | 0.002 |
| 741.0 | 0.002 |
| 740.0 | 0.002 |
| 739.0 | 0.001 |
| 738.0 | 0.001 |
| 737.0 | 0.001 |
| 736.0 | 0.001 |
| 735.0 | 0.001 |
| 734.0 | 0 |
| 733.0 | 0 |
| 732.0 | 0 |
| 731.0 | 0 |
| 730.0 | 0 |
| 729.0 | 0 |
| 728.0 | 0 |
| 727.0 | 0 |
| 726.0 | 0 |
| 725.0 | 0 |
| 724.0 | 0 |
| 723.0 | 0 |
| 722.0 | 0 |
| 721.0 | 0 |
| 720.0 | 0 |
| 719.0 | 0 |
| 718.0 | 0 |
| 717.0 | 0 |
| 716.0 | 0 |
| 715.0 | 0 |
| 714.0 | 0 |
| 713.0 | 0 |
| 712.0 | 0 |
| 711.0 | 0 |
| 710.0 | 0 |
| 709.0 | 0 |
| 708.0 | 0 |
| 707.0 | 0 |
| 706.0 | 0 |
| 705.0 | 0 |
| 704.0 | 0 |
| 703.0 | 0 |
| 702.0 | 0 |
| 701.0 | 0 |
| 700.0 | 0 |
| 699.0 | 0 |
| 698.0 | 0 |
| 697.0 | 0 |
| 696.0 | 0 |
| 695.0 | 0 |
| 694.0 | 0 |
| 693.0 | 0 |
| 692.0 | 0 |
| 691.0 | 0 |
| 690.0 | 0 |
| 689.0 | 0 |
| 688.0 | 0 |
| 687.0 | 0 |
| 686.0 | 0 |
| 685.0 | 0 |
| 684.0 | 0 |
| 683.0 | 0 |
| 682.0 | 0 |
| 681.0 | 0 |
| 680.0 | 0 |
| 679.0 | 0 |
| 678.0 | 0 |
| 677.0 | 0 |
| 676.0 | 0 |
| 675.0 | 0 |
| 674.0 | 0 |
| 673.0 | 0 |
| 672.0 | 0 |
| 671.0 | 0 |
| 670.0 | 0 |
| 669.0 | 0 |
| 668.0 | 0 |
| 667.0 | 0 |
| 666.0 | 0 |
| 665.0 | 0 |
| 664.0 | 0 |
| 663.0 | 0 |
| 662.0 | 0 |
| 661.0 | 0 |
| 660.0 | 0 |
| 659.0 | 0 |
| 658.0 | 0 |
| 657.0 | 0 |
| 656.0 | 0 |
| 655.0 | 0 |
| 654.0 | 0 |
| 653.0 | 0 |
| 652.0 | 0 |
| 651.0 | 0 |
| 650.0 | 0 |
| 649.0 | 0 |
| 648.0 | 0 |
| 647.0 | 0 |
| 646.0 | 0 |
| 645.0 | 0 |
| 644.0 | 0 |
| 643.0 | 0 |
| 642.0 | 0 |
| 641.0 | 0 |
| 640.0 | 0 |
| 639.0 | 0 |
| 638.0 | 0 |
| 637.0 | 0 |
| 636.0 | 0 |
| 635.0 | 0 |
| 634.0 | 0.001 |
| 633.0 | 0.001 |
| 632.0 | 0.001 |
| 631.0 | 0.001 |
| 630.0 | 0.001 |
| 629.0 | 0.001 |
| 628.0 | 0.002 |
| 627.0 | 0.002 |
| 626.0 | 0.002 |
| 625.0 | 0.003 |
| 624.0 | 0.004 |
| 623.0 | 0.005 |
| 622.0 | 0.006 |
| 621.0 | 0.008 |
| 620.0 | 0.01 |
| 619.0 | 0.014 |
| 618.0 | 0.02 |
| 617.0 | 0.028 |
| 616.0 | 0.041 |
| 615.0 | 0.061 |
| 614.0 | 0.094 |
| 613.0 | 0.15 |
| 612.0 | 0.251 |
| 611.0 | 0.438 |
| 610.0 | 0.809 |
| 609.0 | 1.604 |
| 608.0 | 3.3 |
| 607.0 | 6.83 |
| 606.0 | 13.253 |
| 605.0 | 22.71 |
| 604.0 | 33.334 |
| 603.0 | 42.716 |
| 602.0 | 49.445 |
| 601.0 | 53.263 |
| 600.0 | 54.09 |
| 599.0 | 53.434 |
| 598.0 | 53.38 |
| 597.0 | 52.256 |
| 596.0 | 43.656 |
| 595.0 | 27.384 |
| 594.0 | 12.766 |
| 593.0 | 5 |
| 592.0 | 2.025 |
| 591.0 | 0.907 |
| 590.0 | 0.444 |
| 589.0 | 0.238 |
| 588.0 | 0.135 |
| 587.0 | 0.081 |
| 586.0 | 0.051 |
| 585.0 | 0.033 |
| 584.0 | 0.022 |
| 583.0 | 0.015 |
| 582.0 | 0.01 |
| 581.0 | 0.007 |
| 580.0 | 0.005 |
| 579.0 | 0.004 |
| 578.0 | 0.003 |
| 577.0 | 0.002 |
| 576.0 | 0.001 |
| 575.0 | 0.001 |
| 574.0 | 0.001 |
| 573.0 | 0.001 |
| 572.0 | 0 |
| 571.0 | 0 |
| 570.0 | 0 |
| 569.0 | 0 |
| 568.0 | 0 |
| 567.0 | 0 |
| 566.0 | 0 |
| 565.0 | 0 |
| 564.0 | 0 |
| 563.0 | 0 |
| 562.0 | 0 |
| 561.0 | 0 |
| 560.0 | 0 |
| 559.0 | 0 |
| 558.0 | 0 |
| 557.0 | 0 |
| 556.0 | 0 |
| 555.0 | 0 |
| 554.0 | 0 |
| 553.0 | 0 |
| 552.0 | 0 |
| 551.0 | 0 |
| 550.0 | 0 |
| 549.0 | 0 |
| 548.0 | 0 |
| 547.0 | 0 |
| 546.0 | 0 |
| 545.0 | 0 |
| 544.0 | 0 |
| 543.0 | 0 |
| 542.0 | 0 |
| 541.0 | 0 |
| 540.0 | 0 |
| 539.0 | 0 |
| 538.0 | 0 |
| 537.0 | 0 |
| 536.0 | 0 |
| 535.0 | 0 |
| 534.0 | 0 |
| 533.0 | 0 |
| 532.0 | 0 |
| 531.0 | 0 |
| 530.0 | 0 |
| 529.0 | 0 |
| 528.0 | 0 |
| 527.0 | 0 |
| 526.0 | 0 |
| 525.0 | 0 |
| 524.0 | 0 |
| 523.0 | 0 |
| 522.0 | 0 |
| 521.0 | 0 |
| 520.0 | 0 |
| 519.0 | 0 |
| 518.0 | 0 |
| 517.0 | 0 |
| 516.0 | 0 |
| 515.0 | 0 |
| 514.0 | 0 |
| 513.0 | 0 |
| 512.0 | 0 |
| 511.0 | 0 |
| 510.0 | 0 |
| 509.0 | 0 |
| 508.0 | 0 |
| 507.0 | 0 |
| 506.0 | 0 |
| 505.0 | 0 |
| 504.0 | 0 |
| 503.0 | 0 |
| 502.0 | 0 |
| 501.0 | 0 |
| 500.0 | 0 |
| 499.0 | 0 |
| 498.0 | 0 |
| 497.0 | 0 |
| 496.0 | 0 |
| 495.0 | 0 |
| 494.0 | 0 |
| 493.0 | 0 |
| 492.0 | 0 |
| 491.0 | 0 |
| 490.0 | 0 |
| 489.0 | 0 |
| 488.0 | 0 |
| 487.0 | 0 |
| 486.0 | 0 |
| 485.0 | 0 |
| 484.0 | 0 |
| 483.0 | 0 |
| 482.0 | 0 |
| 481.0 | 0 |
| 480.0 | 0 |
| 479.0 | 0 |
| 478.0 | 0 |
| 477.0 | 0 |
| 476.0 | 0 |
| 475.0 | 0 |
| 474.0 | 0 |
| 473.0 | 0 |
| 472.0 | 0 |
| 471.0 | 0 |
| 470.0 | 0 |
| 469.0 | 0 |
| 468.0 | 0 |
| 467.0 | 0 |
| 466.0 | 0 |
| 465.0 | 0 |
| 464.0 | 0 |
| 463.0 | 0 |
| 462.0 | 0 |
| 461.0 | 0 |
| 460.0 | 0 |
| 459.0 | 0 |
| 458.0 | 0 |
| 457.0 | 0 |
| 456.0 | 0 |
| 455.0 | 0 |
| 454.0 | 0 |
| 453.0 | 0 |
| 452.0 | 0 |
| 451.0 | 0 |
| 450.0 | 0 |
| 449.0 | 0 |
| 448.0 | 0 |
| 447.0 | 0 |
| 446.0 | 0 |
| 445.0 | 0 |
| 444.0 | 0 |
| 443.0 | 0 |
| 442.0 | 0 |
| 441.0 | 0 |
| 440.0 | 0 |
| 439.0 | 0 |
| 438.0 | 0 |
| 437.0 | 0 |
| 436.0 | 0 |
| 435.0 | 0 |
| 434.0 | 0 |
| 433.0 | 0 |
| 432.0 | 0 |
| 431.0 | 0 |
| 430.0 | 0 |
| 429.0 | 0 |
| 428.0 | 0 |
| 427.0 | 0 |
| 426.0 | 0 |
| 425.0 | 0 |
| 424.0 | 0 |
| 423.0 | 0 |
| 422.0 | 0 |
| 421.0 | 0 |
| 420.0 | 0 |
| 419.0 | 0 |
| 418.0 | 0 |
| 417.0 | 0 |
| 416.0 | 0 |
| 415.0 | 0 |
| 414.0 | 0 |
| 413.0 | 0 |
| 412.0 | 0 |
| 411.0 | 0 |
| 410.0 | 0 |
| 409.0 | 0 |
| 408.0 | 0 |
| 407.0 | 0 |
| 406.0 | 0 |
| 405.0 | 0 |
| 404.0 | 0 |
| 403.0 | 0 |
| 402.0 | 0 |
| 401.0 | 0 |
| 400.0 | 0 |
| 399.0 | 0 |
| 398.0 | 0 |
| 397.0 | 0 |
| 396.0 | 0 |
| 395.0 | 0 |
| 394.0 | 0 |
| 393.0 | 0 |
| 392.0 | 0 |
| 391.0 | 0 |
| 390.0 | 0 |
| 389.0 | 0 |
| 388.0 | 0 |
| 387.0 | 0 |
| 386.0 | 0 |
| 385.0 | 0 |
| 384.0 | 0 |
| 383.0 | 0 |
| 382.0 | 0 |
| 381.0 | 0 |
| 380.0 | 0 |
| 379.0 | 0 |
| 378.0 | 0 |
| 377.0 | 0 |
| 376.0 | 0 |
| 375.0 | 0 |
| 374.0 | 0 |
| 373.0 | 0 |
| 372.0 | 0 |
| 371.0 | 0 |
| 370.0 | 0 |
| 369.0 | 0 |
| 368.0 | 0 |
| 367.0 | 0 |
| 366.0 | 0 |
| 365.0 | 0 |
| 364.0 | 0 |
| 363.0 | 0 |
| 362.0 | 0 |
| 361.0 | 0 |
| 360.0 | 0 |
| 359.0 | 0 |
| 358.0 | 0 |
| 357.0 | 0 |
| 356.0 | 0 |
| 355.0 | 0 |
| 354.0 | 0 |
| 353.0 | 0 |
| 352.0 | 0 |
| 351.0 | 0 |
| 350.0 | 0 |
| 349.0 | 0 |
| 348.0 | 0 |
| 347.0 | 0 |
| 346.0 | 0 |
| 345.0 | 0 |
| 344.0 | 0 |
| 343.0 | 0 |
| 342.0 | 0 |
| 341.0 | 0 |
| 340.0 | 0 |
| 339.0 | 0 |
| 338.0 | 0 |
| 337.0 | 0 |
| 336.0 | 0 |
| 335.0 | 0 |
| 334.0 | 0 |
| 333.0 | 0 |
| 332.0 | 0 |
| 331.0 | 0 |
| 330.0 | 0 |
| 329.0 | 0 |
| 328.0 | 0 |
| 327.0 | 0 |
| 326.0 | 0 |
| 325.0 | 0 |
| 324.0 | 0 |
| 323.0 | 0 |
| 322.0 | 0 |
| 321.0 | 0 |
| 320.0 | 0 |
| 319.0 | 0 |
| 318.0 | 0 |
| 317.0 | 0 |
| 316.0 | 0 |
| 315.0 | 0 |
| 314.0 | 0 |
| 313.0 | 0 |
| 312.0 | 0 |
| 311.0 | 0 |
| 310.0 | 0 |
| 309.0 | 0 |
| 308.0 | 0 |
| 307.0 | 0 |
| 306.0 | 0 |
| 305.0 | 0 |
| 304.0 | 0 |
| 303.0 | 0 |
| 302.0 | 0 |
| 301.0 | 0 |
| 300.0 | 0 |
| 299.0 | 0 |
| 298.0 | 0 |
| 297.0 | 0 |
| 296.0 | 0 |
| 295.0 | 0 |
| 294.0 | 0 |
| 293.0 | 0 |
| 292.0 | 0 |
| 291.0 | 0 |
| 290.0 | 0 |
| 289.0 | 0 |
| 288.0 | 0 |
| 287.0 | 0 |
| 286.0 | 0 |
| 285.0 | 0 |
| 284.0 | 0 |
| 283.0 | 0 |
| 282.0 | 0 |
| 281.0 | 0 |
| 280.0 | 0 |
| 279.0 | 0 |
| 278.0 | 0 |
| 277.0 | 0 |
| 276.0 | 0 |
| 275.0 | 0 |
| 274.0 | 0 |
| 273.0 | 0 |
| 272.0 | 0 |
| 271.0 | 0 |
| 270.0 | 0 |
| 269.0 | 0 |
| 268.0 | 0 |
| 267.0 | 0 |
| 266.0 | 0 |
| 265.0 | 0 |
| 264.0 | 0 |
| 263.0 | 0 |
| 262.0 | 0 |
| 261.0 | 0 |
| 260.0 | 0 |
| 259.0 | 0 |
| 258.0 | 0 |
| 257.0 | 0 |
| 256.0 | 0 |
| 255.0 | 0 |
| 254.0 | 0 |
| 253.0 | 0 |
| 252.0 | 0 |
| 251.0 | 0 |
| 250.0 | 0 |
| 249.0 | 0 |
| 248.0 | 0 |
| 247.0 | 0 |
| 246.0 | 0 |
| 245.0 | 0 |
| 244.0 | 0 |
| 243.0 | 0 |
| 242.0 | 0 |
| 241.0 | 0 |
| 240.0 | 0 |
| 239.0 | 0 |
| 238.0 | 0 |
| 237.0 | 0 |
| 236.0 | 0 |
| 235.0 | 0 |
| 234.0 | 0 |
| 233.0 | 0 |
| 232.0 | 0 |
| 231.0 | 0 |
| 230.0 | 0 |
| 229.0 | 0 |
| 228.0 | 0 |
| 227.0 | 0 |
| 226.0 | 0 |
| 225.0 | 0 |
| 224.0 | 0 |
| 223.0 | 0 |
| 222.0 | 0 |
| 221.0 | 0 |
| 220.0 | 0 |
| 219.0 | 0 |
| 218.0 | 0 |
| 217.0 | 0 |
| 216.0 | 0 |
| 215.0 | 0 |
| 214.0 | 0 |
| 213.0 | 0 |
| 212.0 | 0 |
| 211.0 | 0 |
| 210.0 | 0 |
| 209.0 | 0 |
| 208.0 | 0 |
| 207.0 | 0 |
| 206.0 | 0 |
| 205.0 | 0 |
| 204.0 | 0 |
| 203.0 | 0 |
| 202.0 | 0 |
| 201.0 | 0 |